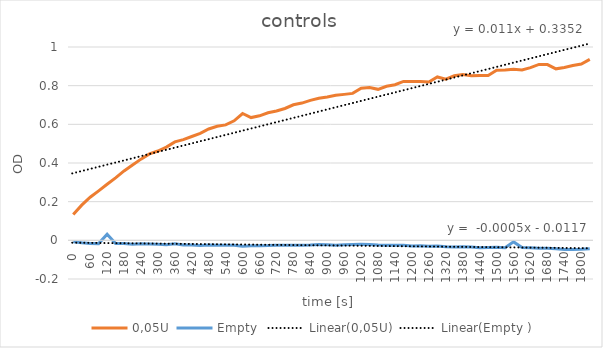
| Category | 0,05U | Empty  |
|---|---|---|
| 0.0 | 0.133 | -0.008 |
| 30.0 | 0.182 | -0.013 |
| 60.0 | 0.223 | -0.016 |
| 90.0 | 0.256 | -0.017 |
| 120.0 | 0.29 | 0.032 |
| 150.0 | 0.323 | -0.017 |
| 180.0 | 0.359 | -0.017 |
| 210.0 | 0.39 | -0.02 |
| 240.0 | 0.42 | -0.018 |
| 270.0 | 0.447 | -0.019 |
| 300.0 | 0.462 | -0.02 |
| 330.0 | 0.482 | -0.023 |
| 360.0 | 0.509 | -0.018 |
| 390.0 | 0.521 | -0.024 |
| 420.0 | 0.537 | -0.024 |
| 450.0 | 0.553 | -0.027 |
| 480.0 | 0.576 | -0.024 |
| 510.0 | 0.59 | -0.026 |
| 540.0 | 0.597 | -0.026 |
| 570.0 | 0.618 | -0.026 |
| 600.0 | 0.656 | -0.031 |
| 630.0 | 0.635 | -0.028 |
| 660.0 | 0.644 | -0.028 |
| 690.0 | 0.66 | -0.027 |
| 720.0 | 0.669 | -0.025 |
| 750.0 | 0.682 | -0.025 |
| 780.0 | 0.701 | -0.026 |
| 810.0 | 0.71 | -0.025 |
| 840.0 | 0.724 | -0.024 |
| 870.0 | 0.735 | -0.022 |
| 900.0 | 0.741 | -0.023 |
| 930.0 | 0.75 | -0.025 |
| 960.0 | 0.755 | -0.023 |
| 990.0 | 0.76 | -0.021 |
| 1020.0 | 0.787 | -0.02 |
| 1050.0 | 0.79 | -0.022 |
| 1080.0 | 0.781 | -0.024 |
| 1110.0 | 0.797 | -0.025 |
| 1140.0 | 0.805 | -0.026 |
| 1170.0 | 0.822 | -0.026 |
| 1200.0 | 0.822 | -0.029 |
| 1230.0 | 0.822 | -0.028 |
| 1260.0 | 0.819 | -0.031 |
| 1290.0 | 0.845 | -0.029 |
| 1320.0 | 0.834 | -0.033 |
| 1350.0 | 0.851 | -0.035 |
| 1380.0 | 0.858 | -0.033 |
| 1410.0 | 0.851 | -0.034 |
| 1440.0 | 0.853 | -0.038 |
| 1470.0 | 0.853 | -0.037 |
| 1500.0 | 0.88 | -0.036 |
| 1530.0 | 0.881 | -0.038 |
| 1560.0 | 0.885 | -0.008 |
| 1590.0 | 0.881 | -0.037 |
| 1620.0 | 0.893 | -0.039 |
| 1650.0 | 0.91 | -0.041 |
| 1680.0 | 0.909 | -0.041 |
| 1710.0 | 0.887 | -0.043 |
| 1740.0 | 0.894 | -0.048 |
| 1770.0 | 0.904 | -0.047 |
| 1800.0 | 0.912 | -0.046 |
| 1830.0 | 0.936 | -0.043 |